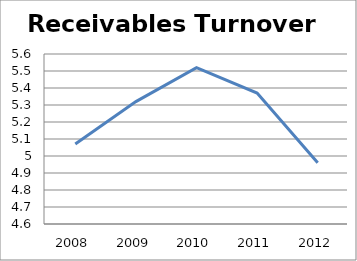
| Category | Series 0 |
|---|---|
| 2008.0 | 5.07 |
| 2009.0 | 5.32 |
| 2010.0 | 5.52 |
| 2011.0 | 5.37 |
| 2012.0 | 4.96 |